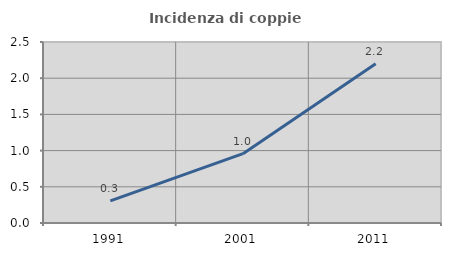
| Category | Incidenza di coppie miste |
|---|---|
| 1991.0 | 0.306 |
| 2001.0 | 0.958 |
| 2011.0 | 2.199 |